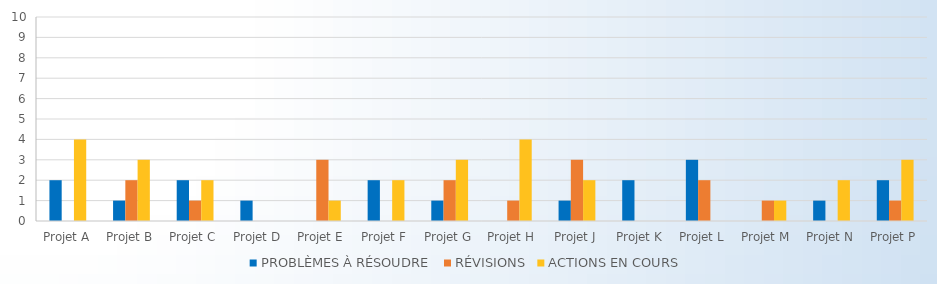
| Category | PROBLÈMES À RÉSOUDRE | RÉVISIONS | ACTIONS EN COURS |
|---|---|---|---|
| Projet A | 2 | 0 | 4 |
| Projet B | 1 | 2 | 3 |
| Projet C | 2 | 1 | 2 |
| Projet D | 1 | 0 | 0 |
| Projet E | 0 | 3 | 1 |
| Projet F | 2 | 0 | 2 |
| Projet G | 1 | 2 | 3 |
| Projet H | 0 | 1 | 4 |
| Projet J | 1 | 3 | 2 |
| Projet K | 2 | 0 | 0 |
| Projet L | 3 | 2 | 0 |
| Projet M | 0 | 1 | 1 |
| Projet N | 1 | 0 | 2 |
| Projet P | 2 | 1 | 3 |